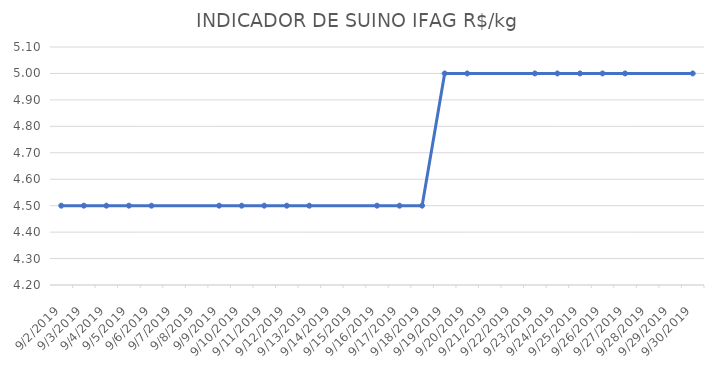
| Category | INDICADOR DE SUINO IFAG |
|---|---|
| 9/2/19 | 4.5 |
| 9/3/19 | 4.5 |
| 9/4/19 | 4.5 |
| 9/5/19 | 4.5 |
| 9/6/19 | 4.5 |
| 9/9/19 | 4.5 |
| 9/10/19 | 4.5 |
| 9/11/19 | 4.5 |
| 9/12/19 | 4.5 |
| 9/13/19 | 4.5 |
| 9/16/19 | 4.5 |
| 9/17/19 | 4.5 |
| 9/18/19 | 4.5 |
| 9/19/19 | 5 |
| 9/20/19 | 5 |
| 9/23/19 | 5 |
| 9/24/19 | 5 |
| 9/25/19 | 5 |
| 9/26/19 | 5 |
| 9/27/19 | 5 |
| 9/30/19 | 5 |